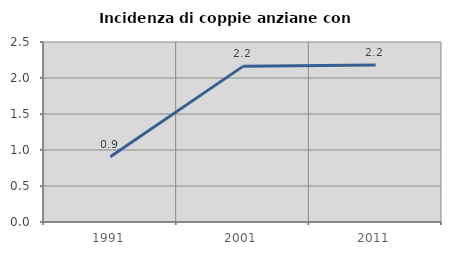
| Category | Incidenza di coppie anziane con figli |
|---|---|
| 1991.0 | 0.906 |
| 2001.0 | 2.161 |
| 2011.0 | 2.182 |